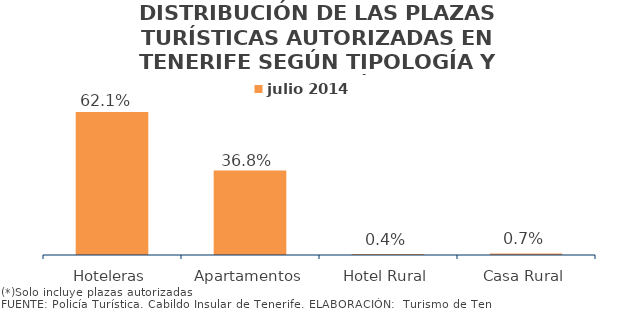
| Category | julio 2014 |
|---|---|
| Hoteleras | 0.621 |
| Apartamentos | 0.368 |
| Hotel Rural | 0.004 |
| Casa Rural | 0.007 |